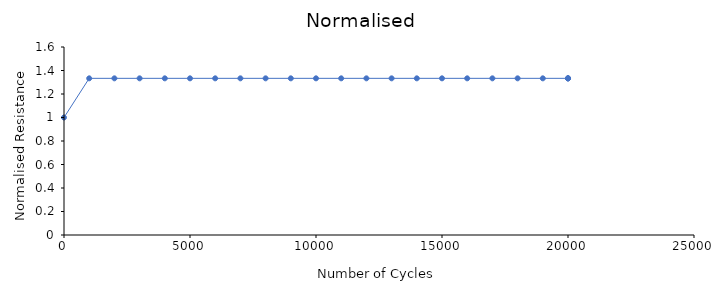
| Category | Normalised |
|---|---|
| 0.0 | 1 |
| 1000.0 | 1.333 |
| 2000.0 | 1.333 |
| 3000.0 | 1.333 |
| 4000.0 | 1.333 |
| 5000.0 | 1.333 |
| 6000.0 | 1.333 |
| 7000.0 | 1.333 |
| 8000.0 | 1.333 |
| 9000.0 | 1.333 |
| 10000.0 | 1.333 |
| 11000.0 | 1.333 |
| 12000.0 | 1.333 |
| 13000.0 | 1.333 |
| 14000.0 | 1.333 |
| 15000.0 | 1.333 |
| 16000.0 | 1.333 |
| 17000.0 | 1.333 |
| 18000.0 | 1.333 |
| 19000.0 | 1.333 |
| 20000.0 | 1.333 |
| 20000.0 | 1.333 |
| 20000.0 | 1.333 |
| 20000.0 | 1.333 |